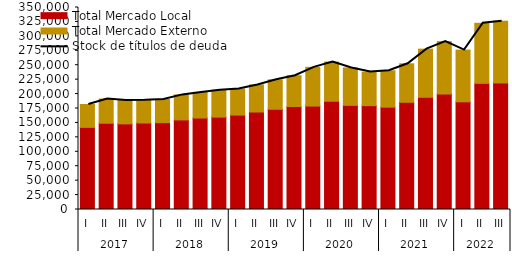
| Category | Total Mercado Local | Total Mercado Externo |
|---|---|---|
| 0 | 142306.926 | 39699.532 |
| 1 | 149501.535 | 41883.972 |
| 2 | 148403.903 | 40410.761 |
| 3 | 149895.839 | 39426.986 |
| 4 | 150450.525 | 40105.384 |
| 5 | 155226.938 | 43340.068 |
| 6 | 158507.222 | 44354.727 |
| 7 | 160112.04 | 46687.209 |
| 8 | 163634.906 | 45192.802 |
| 9 | 168919.452 | 46955.176 |
| 10 | 173632.374 | 51032.848 |
| 11 | 178506.059 | 53267.565 |
| 12 | 179215.88 | 67099.074 |
| 13 | 187583.785 | 67892.871 |
| 14 | 180437.478 | 64805.471 |
| 15 | 179954 | 58117.378 |
| 16 | 177316.36 | 63064.407 |
| 17 | 185768.591 | 66722.208 |
| 18 | 194434.736 | 83392.638 |
| 19 | 200128.909 | 90738.038 |
| 20 | 186666.589 | 89541.021 |
| 21 | 218599.647 | 104036.766 |
| 22 | 219320.556 | 106951.892 |